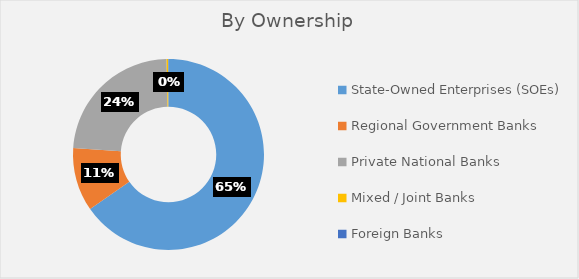
| Category | F. Kepemilikan Bank |
|---|---|
| State-Owned Enterprises (SOEs) | 222232466 |
| Regional Government Banks | 36666788 |
| Private National Banks | 80213159 |
| Mixed / Joint Banks | 865361 |
| Foreign Banks | 229193 |